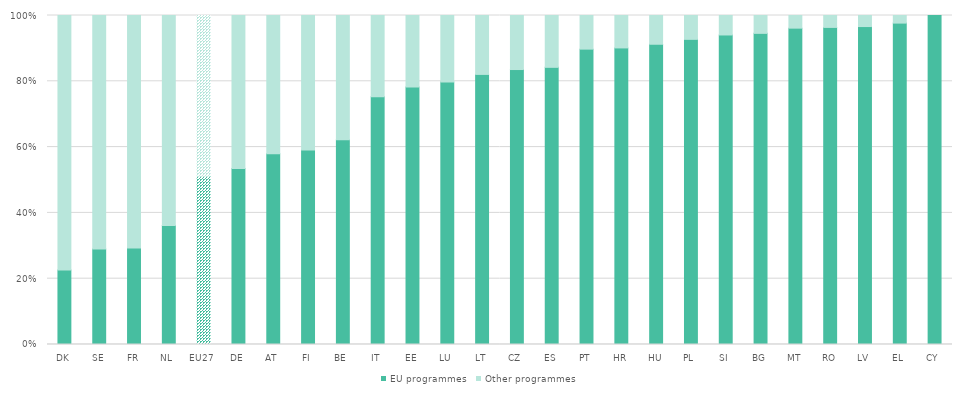
| Category | EU programmes | Other programmes |
|---|---|---|
| DK | 22.648 | 77.352 |
| SE | 29.063 | 70.937 |
| FR | 29.346 | 70.654 |
| NL | 36.146 | 63.854 |
| EU27 | 51.096 | 48.904 |
| DE | 53.477 | 46.523 |
| AT | 57.995 | 42.005 |
| FI | 59.117 | 40.883 |
| BE | 62.26 | 37.74 |
| IT | 75.329 | 24.671 |
| EE | 78.267 | 21.733 |
| LU | 79.817 | 20.183 |
| LT | 82.093 | 17.907 |
| CZ | 83.576 | 16.424 |
| ES | 84.246 | 15.754 |
| PT | 89.779 | 10.221 |
| HR | 90.144 | 9.856 |
| HU | 91.261 | 8.739 |
| PL | 92.751 | 7.249 |
| SI | 94.082 | 5.918 |
| BG | 94.571 | 5.429 |
| MT | 96.154 | 3.846 |
| RO | 96.379 | 3.621 |
| LV | 96.64 | 3.36 |
| EL | 97.689 | 2.311 |
| CY | 100 | 0 |